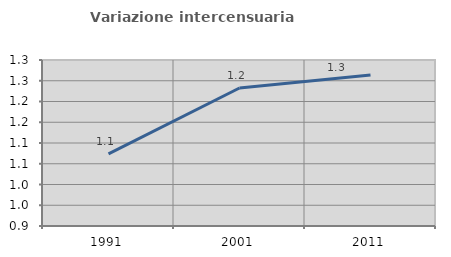
| Category | Variazione intercensuaria annua |
|---|---|
| 1991.0 | 1.074 |
| 2001.0 | 1.233 |
| 2011.0 | 1.264 |